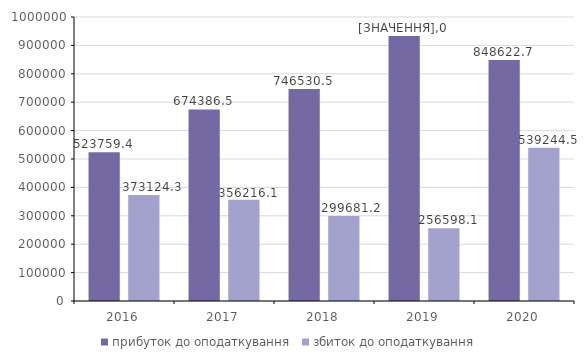
| Category | прибуток до оподаткування | збиток до оподаткування |
|---|---|---|
| 2016.0 | 523759.4 | 373124.3 |
| 2017.0 | 674386.5 | 356216.1 |
| 2018.0 | 746530.5 | 299681.2 |
| 2019.0 | 933160 | 256598.1 |
| 2020.0 | 848622.7 | 539244.5 |